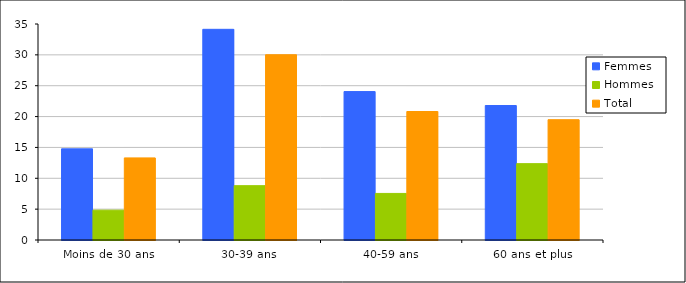
| Category | Femmes | Hommes | Total |
|---|---|---|---|
| Moins de 30 ans | 14.771 | 4.835 | 13.302 |
| 30-39 ans | 34.138 | 8.805 | 30.019 |
| 40-59 ans | 24.051 | 7.546 | 20.82 |
| 60 ans et plus | 21.791 | 12.371 | 19.495 |